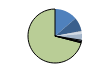
| Category | Series 0 |
|---|---|
| ARRASTRE | 100 |
| CERCO | 60 |
| ATUNEROS CAÑEROS | 2 |
| PALANGRE DE FONDO | 12 |
| PALANGRE DE SUPERFICIE | 27 |
| RASCO | 0 |
| VOLANTA | 6 |
| ARTES FIJAS | 5 |
| ARTES MENORES | 518 |